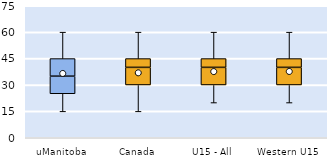
| Category | 25th | 50th | 75th |
|---|---|---|---|
| uManitoba | 25 | 10 | 10 |
| Canada | 30 | 10 | 5 |
| U15 - All | 30 | 10 | 5 |
| Western U15 | 30 | 10 | 5 |